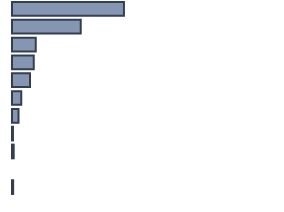
| Category | Series 0 |
|---|---|
| 0 | 42.405 |
| 1 | 26.039 |
| 2 | 9.039 |
| 3 | 8.255 |
| 4 | 6.852 |
| 5 | 3.494 |
| 6 | 2.478 |
| 7 | 0.368 |
| 8 | 0.636 |
| 9 | 0 |
| 10 | 0.436 |